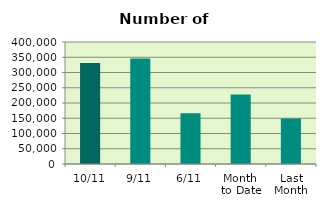
| Category | Series 0 |
|---|---|
| 10/11 | 331394 |
| 9/11 | 345822 |
| 6/11 | 166128 |
| Month 
to Date | 228254.286 |
| Last
Month | 149554.818 |